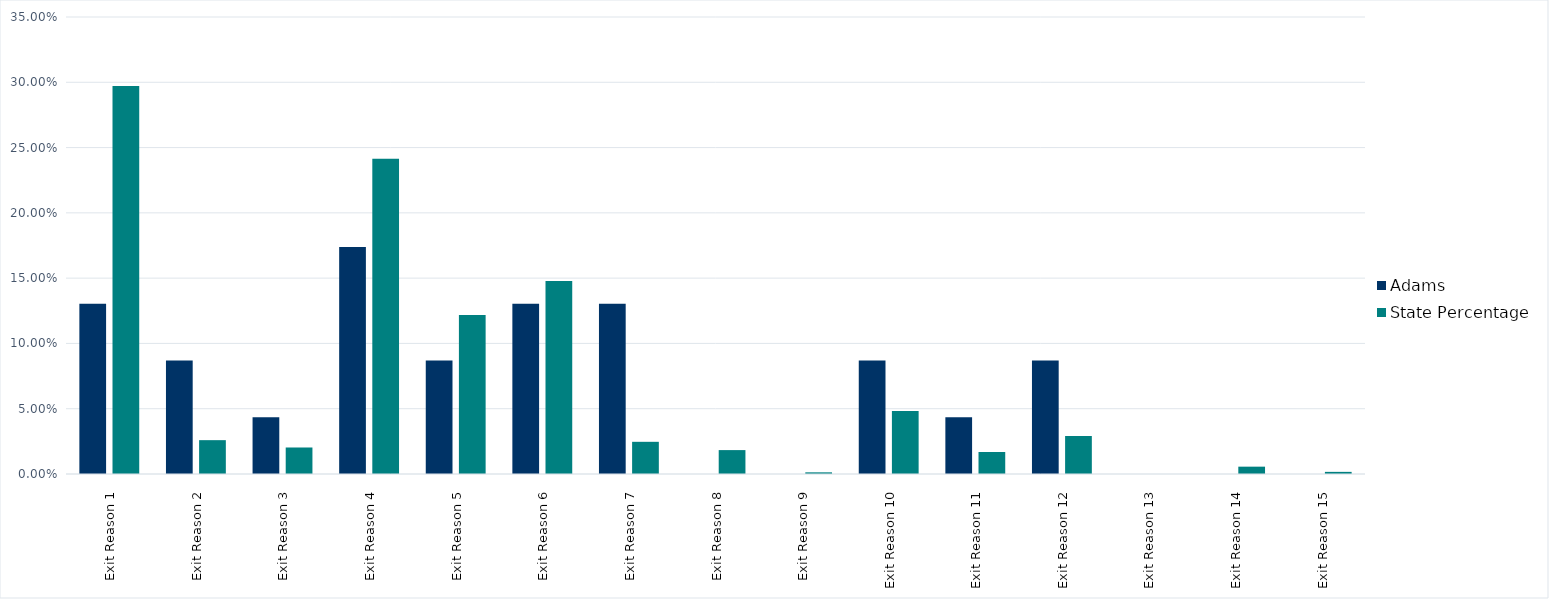
| Category | Adams | State Percentage |
|---|---|---|
| Exit Reason 1 | 0.13 | 0.297 |
| Exit Reason 2 | 0.087 | 0.026 |
| Exit Reason 3 | 0.043 | 0.02 |
| Exit Reason 4 | 0.174 | 0.241 |
| Exit Reason 5 | 0.087 | 0.122 |
| Exit Reason 6 | 0.13 | 0.148 |
| Exit Reason 7 | 0.13 | 0.025 |
| Exit Reason 8 | 0 | 0.018 |
| Exit Reason 9 | 0 | 0.001 |
| Exit Reason 10 | 0.087 | 0.048 |
| Exit Reason 11 | 0.043 | 0.017 |
| Exit Reason 12 | 0.087 | 0.029 |
| Exit Reason 13 | 0 | 0 |
| Exit Reason 14 | 0 | 0.006 |
| Exit Reason 15 | 0 | 0.002 |